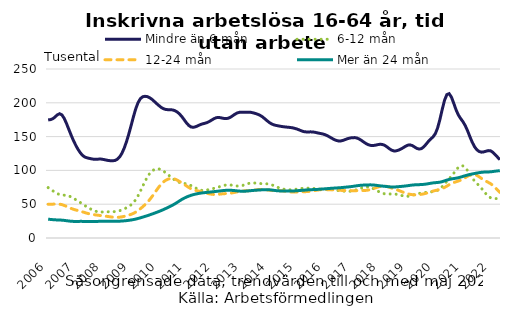
| Category | Mindre än 6 mån | 6-12 mån | 12-24 mån | Mer än 24 mån |
|---|---|---|---|---|
| 2006 | 174.696 | 74.52 | 49.939 | 27.828 |
| 2006-02 | 175.103 | 72.206 | 49.999 | 27.472 |
| 2006-03 | 176.43 | 69.854 | 50.078 | 27.144 |
| 2006-04 | 178.988 | 67.523 | 50.194 | 26.873 |
| 2006-05 | 182.27 | 65.522 | 50.27 | 26.705 |
| 2006-06 | 183.849 | 64.251 | 50.028 | 26.586 |
| 2006-07 | 182.009 | 63.636 | 49.33 | 26.387 |
| 2006-08 | 176.727 | 63.357 | 48.17 | 26.037 |
| 2006-09 | 169.07 | 62.995 | 46.702 | 25.575 |
| 2006-10 | 160.431 | 62.128 | 45.139 | 25.114 |
| 2006-11 | 151.891 | 60.644 | 43.685 | 24.759 |
| 2006-12 | 144.005 | 58.734 | 42.454 | 24.558 |
| 2007 | 137.003 | 56.688 | 41.432 | 24.516 |
| 2007-02 | 130.923 | 54.561 | 40.525 | 24.561 |
| 2007-03 | 125.829 | 52.353 | 39.608 | 24.601 |
| 2007-04 | 121.964 | 50.072 | 38.583 | 24.582 |
| 2007-05 | 119.628 | 47.81 | 37.489 | 24.518 |
| 2007-06 | 118.455 | 45.657 | 36.476 | 24.471 |
| 2007-07 | 117.691 | 43.696 | 35.658 | 24.462 |
| 2007-08 | 116.931 | 41.938 | 35.013 | 24.475 |
| 2007-09 | 116.471 | 40.369 | 34.468 | 24.506 |
| 2007-10 | 116.474 | 39.193 | 33.978 | 24.55 |
| 2007-11 | 116.711 | 38.565 | 33.52 | 24.604 |
| 2007-12 | 116.703 | 38.4 | 33.097 | 24.661 |
| 2008 | 116.193 | 38.489 | 32.685 | 24.696 |
| 2008-02 | 115.418 | 38.654 | 32.254 | 24.695 |
| 2008-03 | 114.725 | 38.754 | 31.774 | 24.658 |
| 2008-04 | 114.333 | 38.787 | 31.299 | 24.617 |
| 2008-05 | 114.235 | 38.856 | 30.903 | 24.594 |
| 2008-06 | 114.708 | 39.095 | 30.644 | 24.608 |
| 2008-07 | 116.414 | 39.551 | 30.589 | 24.699 |
| 2008-08 | 119.774 | 40.338 | 30.827 | 24.878 |
| 2008-09 | 125.257 | 41.539 | 31.331 | 25.108 |
| 2008-10 | 132.953 | 43.052 | 32.038 | 25.383 |
| 2008-11 | 142.564 | 44.755 | 32.901 | 25.715 |
| 2008-12 | 153.864 | 46.699 | 33.88 | 26.13 |
| 2009 | 166.401 | 49.088 | 35.01 | 26.639 |
| 2009-02 | 179.273 | 52.318 | 36.437 | 27.257 |
| 2009-03 | 191.061 | 56.721 | 38.315 | 27.996 |
| 2009-04 | 200.195 | 62.442 | 40.618 | 28.863 |
| 2009-05 | 206.059 | 69.151 | 43.243 | 29.838 |
| 2009-06 | 208.874 | 76.347 | 46.098 | 30.868 |
| 2009-07 | 209.578 | 83.501 | 49.184 | 31.915 |
| 2009-08 | 209.144 | 89.973 | 52.613 | 33.008 |
| 2009-09 | 207.624 | 95.183 | 56.522 | 34.152 |
| 2009-10 | 205.242 | 98.876 | 60.935 | 35.338 |
| 2009-11 | 202.21 | 101.182 | 65.694 | 36.577 |
| 2009-12 | 199.035 | 102.306 | 70.547 | 37.853 |
| 2010 | 196.067 | 102.283 | 75.281 | 39.152 |
| 2010-02 | 193.319 | 101.161 | 79.508 | 40.523 |
| 2010-03 | 191.256 | 99.116 | 82.895 | 42.006 |
| 2010-04 | 190.169 | 96.485 | 85.378 | 43.578 |
| 2010-05 | 189.8 | 93.68 | 87.023 | 45.204 |
| 2010-06 | 189.821 | 90.929 | 87.882 | 46.869 |
| 2010-07 | 189.422 | 88.224 | 87.934 | 48.616 |
| 2010-08 | 188.359 | 85.602 | 87.136 | 50.529 |
| 2010-09 | 186.399 | 83.487 | 85.611 | 52.654 |
| 2010-10 | 183.455 | 82.166 | 83.607 | 54.888 |
| 2010-11 | 179.589 | 81.417 | 81.462 | 57.023 |
| 2010-12 | 175.025 | 80.784 | 79.276 | 58.905 |
| 2011 | 170.404 | 80.014 | 77.016 | 60.54 |
| 2011-02 | 166.572 | 78.953 | 74.803 | 61.943 |
| 2011-03 | 164.268 | 77.559 | 72.854 | 63.141 |
| 2011-04 | 163.727 | 75.876 | 71.407 | 64.14 |
| 2011-05 | 164.557 | 74.034 | 70.432 | 64.982 |
| 2011-06 | 166.086 | 72.213 | 69.662 | 65.704 |
| 2011-07 | 167.662 | 70.875 | 68.874 | 66.31 |
| 2011-08 | 168.824 | 70.348 | 67.948 | 66.777 |
| 2011-09 | 169.7 | 70.505 | 66.978 | 67.153 |
| 2011-10 | 170.787 | 71.044 | 66.089 | 67.488 |
| 2011-11 | 172.493 | 71.763 | 65.324 | 67.853 |
| 2011-12 | 174.551 | 72.608 | 64.723 | 68.225 |
| 2012 | 176.578 | 73.533 | 64.352 | 68.602 |
| 2012-02 | 178.008 | 74.489 | 64.325 | 68.98 |
| 2012-03 | 178.38 | 75.499 | 64.654 | 69.372 |
| 2012-04 | 177.794 | 76.54 | 65.131 | 69.789 |
| 2012-05 | 176.995 | 77.513 | 65.488 | 70.183 |
| 2012-06 | 176.653 | 78.288 | 65.694 | 70.478 |
| 2012-07 | 177.064 | 78.645 | 65.92 | 70.632 |
| 2012-08 | 178.425 | 78.5 | 66.289 | 70.607 |
| 2012-09 | 180.651 | 77.999 | 66.85 | 70.411 |
| 2012-10 | 183.029 | 77.376 | 67.561 | 70.085 |
| 2012-11 | 184.895 | 76.908 | 68.223 | 69.694 |
| 2012-12 | 185.921 | 76.859 | 68.823 | 69.372 |
| 2013 | 186.15 | 77.37 | 69.364 | 69.197 |
| 2013-02 | 186.136 | 78.425 | 69.719 | 69.193 |
| 2013-03 | 186.149 | 79.679 | 69.886 | 69.374 |
| 2013-04 | 186.183 | 80.715 | 69.997 | 69.7 |
| 2013-05 | 185.855 | 81.294 | 70.222 | 70.052 |
| 2013-06 | 185.114 | 81.426 | 70.6 | 70.368 |
| 2013-07 | 184.151 | 81.27 | 71.064 | 70.649 |
| 2013-08 | 182.961 | 80.931 | 71.52 | 70.885 |
| 2013-09 | 181.366 | 80.558 | 71.772 | 71.086 |
| 2013-10 | 179.191 | 80.319 | 71.77 | 71.299 |
| 2013-11 | 176.397 | 80.236 | 71.57 | 71.462 |
| 2013-12 | 173.459 | 80.113 | 71.185 | 71.49 |
| 2014 | 170.792 | 79.681 | 70.741 | 71.325 |
| 2014-02 | 168.697 | 78.736 | 70.386 | 70.969 |
| 2014-03 | 167.315 | 77.369 | 70.168 | 70.5 |
| 2014-04 | 166.443 | 75.846 | 70.057 | 70.057 |
| 2014-05 | 165.785 | 74.43 | 70.014 | 69.753 |
| 2014-06 | 165.156 | 73.27 | 69.944 | 69.58 |
| 2014-07 | 164.647 | 72.388 | 69.655 | 69.482 |
| 2014-08 | 164.24 | 71.766 | 69.128 | 69.411 |
| 2014-09 | 163.87 | 71.416 | 68.537 | 69.351 |
| 2014-10 | 163.514 | 71.295 | 68.067 | 69.351 |
| 2014-11 | 163.01 | 71.46 | 67.862 | 69.466 |
| 2014-12 | 162.189 | 71.861 | 67.916 | 69.681 |
| 2015 | 161.126 | 72.365 | 68.074 | 69.931 |
| 2015-02 | 159.803 | 72.881 | 68.238 | 70.193 |
| 2015-03 | 158.411 | 73.328 | 68.397 | 70.458 |
| 2015-04 | 157.32 | 73.654 | 68.522 | 70.734 |
| 2015-05 | 156.906 | 73.785 | 68.612 | 71.018 |
| 2015-06 | 156.958 | 73.717 | 68.753 | 71.275 |
| 2015-07 | 157.006 | 73.547 | 69.091 | 71.455 |
| 2015-08 | 156.785 | 73.302 | 69.671 | 71.588 |
| 2015-09 | 156.21 | 73.045 | 70.389 | 71.734 |
| 2015-10 | 155.418 | 72.815 | 71.018 | 71.926 |
| 2015-11 | 154.705 | 72.545 | 71.366 | 72.168 |
| 2015-12 | 154.033 | 72.295 | 71.466 | 72.448 |
| 2016 | 153.014 | 72.139 | 71.466 | 72.722 |
| 2016-02 | 151.531 | 72.078 | 71.457 | 72.995 |
| 2016-03 | 149.709 | 71.954 | 71.441 | 73.277 |
| 2016-04 | 147.738 | 71.6 | 71.373 | 73.55 |
| 2016-05 | 145.824 | 71.131 | 71.234 | 73.8 |
| 2016-06 | 144.361 | 70.592 | 71.016 | 74.023 |
| 2016-07 | 143.587 | 70.069 | 70.746 | 74.241 |
| 2016-08 | 143.618 | 69.689 | 70.497 | 74.502 |
| 2016-09 | 144.45 | 69.363 | 70.305 | 74.822 |
| 2016-10 | 145.762 | 69.074 | 70.187 | 75.164 |
| 2016-11 | 147.002 | 68.952 | 70.139 | 75.5 |
| 2016-12 | 147.907 | 69.182 | 70.1 | 75.853 |
| 2017 | 148.449 | 69.745 | 70.054 | 76.278 |
| feb-17 | 148.493 | 70.498 | 70.055 | 76.786 |
| mar-17 | 147.845 | 71.529 | 70.073 | 77.316 |
| apr-17 | 146.366 | 72.755 | 70.105 | 77.765 |
| maj-17 | 144.214 | 73.978 | 70.121 | 78.082 |
| jun-17 | 141.799 | 75.02 | 70.196 | 78.288 |
| jul-17 | 139.578 | 75.608 | 70.47 | 78.445 |
| aug-17 | 137.914 | 75.49 | 71.008 | 78.573 |
| sep-17 | 136.947 | 74.66 | 71.839 | 78.603 |
| okt-17 | 136.747 | 73.241 | 72.913 | 78.443 |
| nov-17 | 137.29 | 71.409 | 74.124 | 78.082 |
| dec-17 | 138.09 | 69.403 | 75.311 | 77.612 |
| 2018 | 138.635 | 67.583 | 76.268 | 77.172 |
| feb-18 | 138.406 | 66.228 | 76.825 | 76.818 |
| mar-18 | 137.127 | 65.424 | 76.832 | 76.488 |
| apr-18 | 134.88 | 65.142 | 76.264 | 76.124 |
| maj-18 | 132.205 | 65.142 | 75.238 | 75.744 |
| jun-18 | 129.936 | 65.158 | 73.994 | 75.495 |
| jul-18 | 128.78 | 65.051 | 72.775 | 75.468 |
| aug-18 | 128.908 | 64.743 | 71.632 | 75.649 |
| sep-18 | 129.947 | 64.138 | 70.454 | 75.944 |
| okt-18 | 131.513 | 63.252 | 69.136 | 76.247 |
| nov-18 | 133.405 | 62.31 | 67.736 | 76.555 |
| dec-18 | 135.555 | 61.675 | 66.422 | 76.928 |
| 2019 | 137.293 | 61.667 | 65.364 | 77.393 |
| feb-19 | 137.784 | 62.316 | 64.604 | 77.888 |
| mar-19 | 136.709 | 63.251 | 64.108 | 78.315 |
| apr-19 | 134.604 | 64.195 | 63.853 | 78.613 |
| maj-19 | 132.514 | 65.042 | 63.887 | 78.791 |
| jun-19 | 131.569 | 65.842 | 64.167 | 78.921 |
| jul-19 | 132.279 | 66.556 | 64.637 | 79.092 |
| aug-19 | 134.852 | 67.112 | 65.318 | 79.357 |
| sep-19 | 138.737 | 67.484 | 66.175 | 79.772 |
| okt-19 | 142.883 | 67.782 | 67.197 | 80.35 |
| nov-19 | 146.416 | 68.126 | 68.321 | 80.98 |
| dec-19 | 149.538 | 68.633 | 69.373 | 81.501 |
| 2020 | 154.313 | 69.354 | 70.247 | 81.849 |
| feb-20 | 162.83 | 70.603 | 70.993 | 82.123 |
| mar-20 | 175.419 | 72.789 | 71.865 | 82.572 |
| apr-20 | 190.286 | 76.016 | 73.114 | 83.38 |
| maj-20 | 203.76 | 79.904 | 74.783 | 84.49 |
| jun-20 | 212.107 | 83.826 | 76.774 | 85.65 |
| jul-20 | 213.522 | 87.55 | 78.772 | 86.645 |
| aug-20 | 208.307 | 91.464 | 80.541 | 87.376 |
| sep-20 | 199.248 | 95.866 | 82.007 | 87.914 |
| okt-20 | 189.586 | 100.498 | 83.19 | 88.452 |
| nov-20 | 181.958 | 104.499 | 84.281 | 89.171 |
| dec-20 | 176.655 | 106.759 | 85.549 | 90.11 |
| 2021 | 171.971 | 106.657 | 87.183 | 91.148 |
| feb-21 | 166.148 | 104.141 | 89.227 | 92.181 |
| mar-21 | 158.575 | 99.744 | 91.411 | 93.128 |
| apr-21 | 149.908 | 94.328 | 93.228 | 93.959 |
| maj-21 | 141.77 | 88.929 | 94.179 | 94.713 |
| jun-21 | 135.177 | 84.417 | 93.985 | 95.406 |
| jul-21 | 130.63 | 80.806 | 92.691 | 96.054 |
| aug-21 | 127.998 | 77.407 | 90.57 | 96.654 |
| sep-21 | 126.988 | 73.649 | 88.166 | 97.148 |
| okt-21 | 127.361 | 69.401 | 85.929 | 97.474 |
| nov-21 | 128.427 | 65.188 | 83.992 | 97.619 |
| dec-21 | 129.266 | 61.722 | 82.253 | 97.701 |
| 2022 | 128.918 | 59.476 | 80.334 | 97.922 |
| feb-22 | 126.689 | 58.558 | 77.694 | 98.334 |
| mar-22 | 123.278 | 58.295 | 74.452 | 98.821 |
| apr-22 | 119.581 | 58.252 | 70.995 | 99.268 |
| maj-22 | 115.785 | 58.414 | 67.556 | 99.647 |